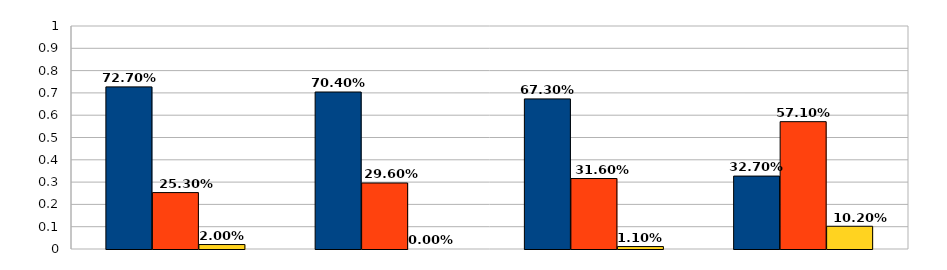
| Category | Хорошо | Удовлетворительно | Неудовлетворительно |
|---|---|---|---|
| 0 | 0.727 | 0.253 | 0.02 |
| 1 | 0.704 | 0.296 | 0 |
| 2 | 0.673 | 0.316 | 0.011 |
| 3 | 0.327 | 0.571 | 0.102 |